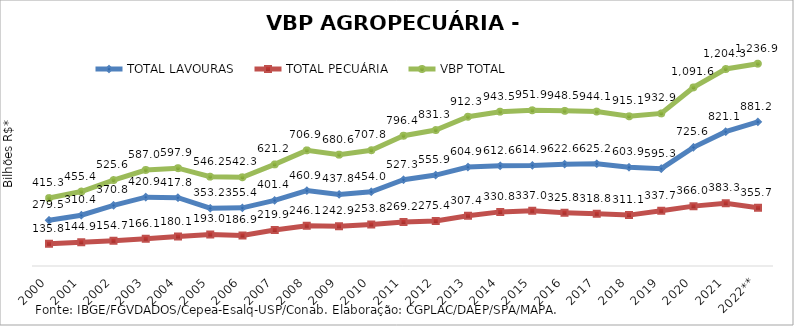
| Category | TOTAL LAVOURAS | TOTAL PECUÁRIA | VBP TOTAL |
|---|---|---|---|
| 2000 | 279.474 | 135.849 | 415.323 |
| 2001 | 310.444 | 144.934 | 455.378 |
| 2002 | 370.836 | 154.718 | 525.554 |
| 2003 | 420.896 | 166.063 | 586.959 |
| 2004 | 417.814 | 180.131 | 597.945 |
| 2005 | 353.243 | 192.964 | 546.207 |
| 2006 | 355.401 | 186.888 | 542.289 |
| 2007 | 401.361 | 219.863 | 621.224 |
| 2008 | 460.861 | 246.079 | 706.94 |
| 2009 | 437.757 | 242.879 | 680.635 |
| 2010 | 454.002 | 253.761 | 707.763 |
| 2011 | 527.268 | 269.175 | 796.443 |
| 2012 | 555.94 | 275.35 | 831.29 |
| 2013 | 604.866 | 307.395 | 912.262 |
| 2014 | 612.648 | 330.845 | 943.493 |
| 2015 | 614.871 | 337.041 | 951.912 |
| 2016 | 622.646 | 325.834 | 948.48 |
| 2017 | 625.232 | 318.833 | 944.064 |
| 2018 | 603.939 | 311.122 | 915.06 |
| 2019 | 595.254 | 337.657 | 932.91 |
| 2020 | 725.628 | 365.998 | 1091.626 |
| 2021 | 821.066 | 383.281 | 1204.347 |
| 2022** | 881.175 | 355.696 | 1236.872 |